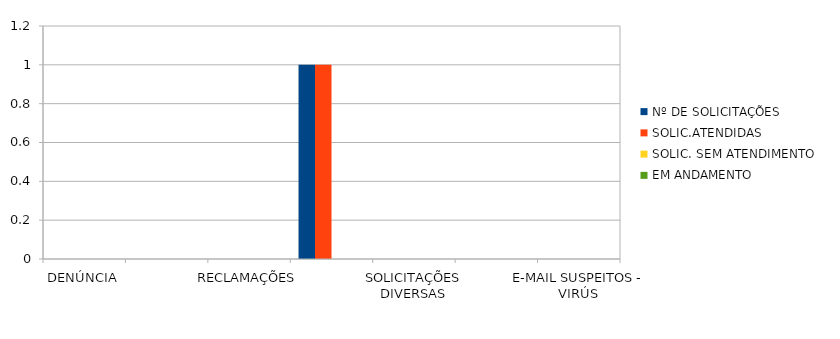
| Category | Nº DE SOLICITAÇÕES | SOLIC.ATENDIDAS | SOLIC. SEM ATENDIMENTO | EM ANDAMENTO |
|---|---|---|---|---|
| DENÚNCIA | 0 | 0 | 0 | 0 |
| DÚVIDA | 0 | 0 | 0 | 0 |
| RECLAMAÇÕES | 0 | 0 | 0 | 0 |
| PEDIDO DE ACESSO À INFORMAÇÃO | 1 | 1 | 0 | 0 |
| SOLICITAÇÕES DIVERSAS | 0 | 0 | 0 | 0 |
| SUGESTÃO  | 0 | 0 | 0 | 0 |
| E-MAIL SUSPEITOS - VIRÚS | 0 | 0 | 0 | 0 |